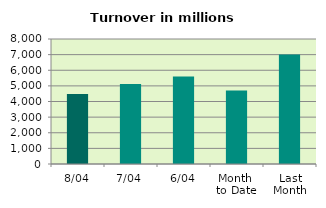
| Category | Series 0 |
|---|---|
| 8/04 | 4482.092 |
| 7/04 | 5115.615 |
| 6/04 | 5598.409 |
| Month 
to Date | 4704.372 |
| Last
Month | 7002.451 |